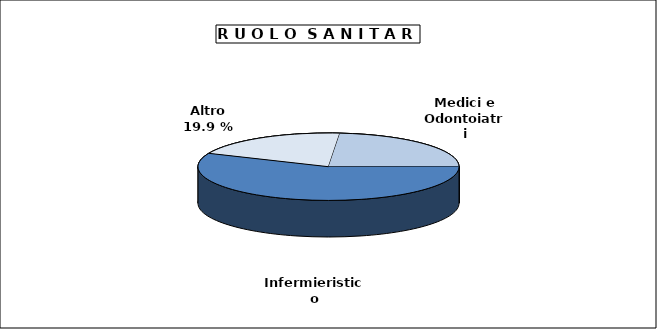
| Category | Medici Odontoiatri ASL SSN |
|---|---|
| Medici e Odontoiatri | 69391 |
| Infermieristico | 167037 |
| Altro | 58682 |